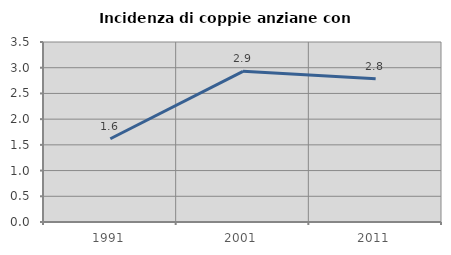
| Category | Incidenza di coppie anziane con figli |
|---|---|
| 1991.0 | 1.619 |
| 2001.0 | 2.93 |
| 2011.0 | 2.786 |